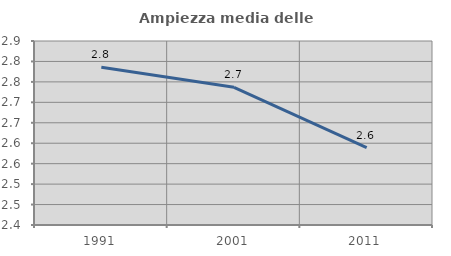
| Category | Ampiezza media delle famiglie |
|---|---|
| 1991.0 | 2.786 |
| 2001.0 | 2.737 |
| 2011.0 | 2.589 |